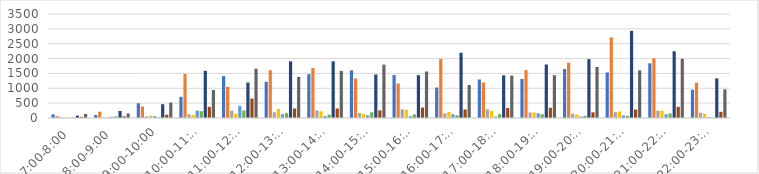
| Category | Series 0 | Series 1 | Series 2 | Series 3 | Series 4 | Series 5 | Series 6 | Series 7 | Series 8 |
|---|---|---|---|---|---|---|---|---|---|
| 7:00-8:00 | 124 | 60 | 28 | 20 | 8 | 12 | 80 | 36 | 136 |
| 8:00-9:00 | 100 | 212 | 16 | 24 | 40 | 52 | 236 | 56 | 152 |
| 9:00-10:00 | 496 | 388 | 52 | 76 | 60 | 24 | 464 | 112 | 520 |
| 10:00-11:00 | 712 | 1484 | 128 | 104 | 248 | 228 | 1588 | 376 | 940 |
| 11:00-12:00 | 1408 | 1048 | 248 | 144 | 408 | 252 | 1192 | 656 | 1660 |
| 12:00-13:00 | 1220 | 1608 | 192 | 300 | 128 | 164 | 1908 | 320 | 1384 |
| 13:00-14:00 | 1472 | 1684 | 256 | 224 | 64 | 112 | 1908 | 320 | 1584 |
| 14:00-15:00 | 1604 | 1328 | 168 | 136 | 88 | 192 | 1464 | 256 | 1796 |
| 15:00-16:00 | 1444 | 1164 | 292 | 276 | 60 | 120 | 1440 | 352 | 1564 |
| 16:00-17:00 | 1024 | 1988 | 160 | 208 | 128 | 88 | 2196 | 288 | 1112 |
| 17:00-18:00 | 1296 | 1196 | 292 | 240 | 48 | 132 | 1436 | 340 | 1428 |
| 18:00-19:00 | 1312 | 1612 | 184 | 188 | 160 | 128 | 1800 | 344 | 1440 |
| 19:00-20:00 | 1648 | 1864 | 144 | 116 | 48 | 72 | 1980 | 192 | 1720 |
| 20:00-21:00 | 1532 | 2712 | 196 | 220 | 88 | 72 | 2932 | 284 | 1604 |
| 21:00-22:00 | 1840 | 2008 | 248 | 240 | 128 | 152 | 2248 | 376 | 1992 |
| 22:00-23:00 | 952 | 1188 | 180 | 144 | 28 | 12 | 1332 | 208 | 964 |